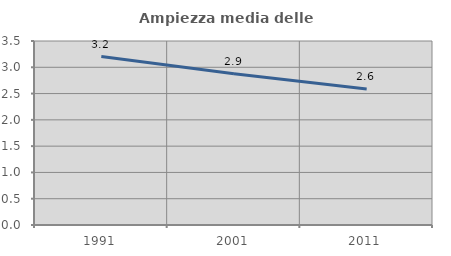
| Category | Ampiezza media delle famiglie |
|---|---|
| 1991.0 | 3.205 |
| 2001.0 | 2.878 |
| 2011.0 | 2.587 |